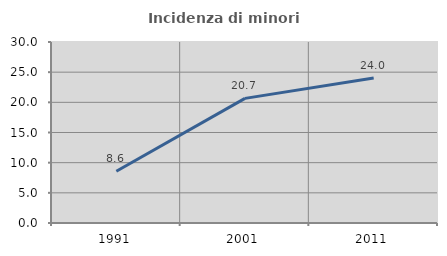
| Category | Incidenza di minori stranieri |
|---|---|
| 1991.0 | 8.571 |
| 2001.0 | 20.657 |
| 2011.0 | 24.025 |